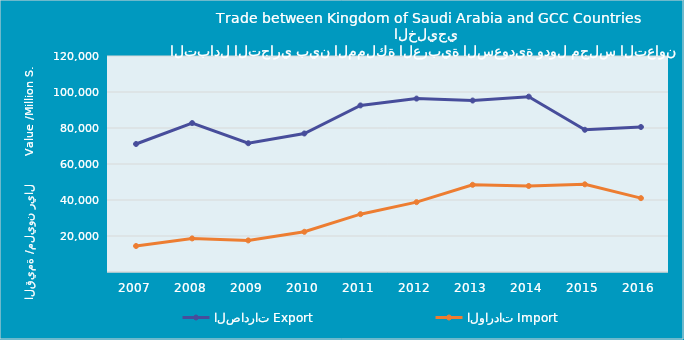
| Category | الصادرات | الواردات |
|---|---|---|
| 2007.0 | 71119905823 | 14446275767 |
| 2008.0 | 82744125510 | 18652104197 |
| 2009.0 | 71542563221 | 17545127199 |
| 2010.0 | 76952503775 | 22336613999 |
| 2011.0 | 92535857902 | 32133094981 |
| 2012.0 | 96339942730 | 38809080607 |
| 2013.0 | 95263762977 | 48447786669 |
| 2014.0 | 97413372912 | 47792780684 |
| 2015.0 | 79009333944 | 48713673280 |
| 2016.0 | 80557813041 | 41032782631 |